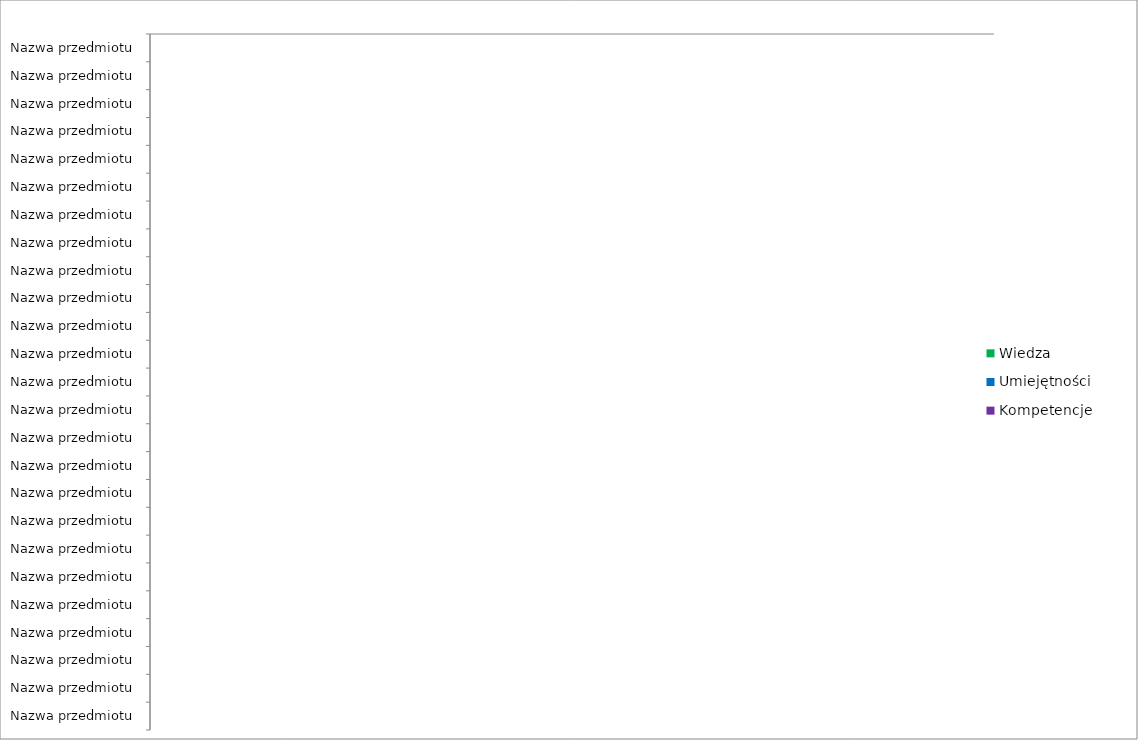
| Category | Wiedza | Umiejętności | Kompetencje |
|---|---|---|---|
| Nazwa przedmiotu | 0 | 0 | 0 |
| Nazwa przedmiotu | 0 | 0 | 0 |
| Nazwa przedmiotu | 0 | 0 | 0 |
| Nazwa przedmiotu | 0 | 0 | 0 |
| Nazwa przedmiotu | 0 | 0 | 0 |
| Nazwa przedmiotu | 0 | 0 | 0 |
| Nazwa przedmiotu | 0 | 0 | 0 |
| Nazwa przedmiotu | 0 | 0 | 0 |
| Nazwa przedmiotu | 0 | 0 | 0 |
| Nazwa przedmiotu | 0 | 0 | 0 |
| Nazwa przedmiotu | 0 | 0 | 0 |
| Nazwa przedmiotu | 0 | 0 | 0 |
| Nazwa przedmiotu | 0 | 0 | 0 |
| Nazwa przedmiotu | 0 | 0 | 0 |
| Nazwa przedmiotu | 0 | 0 | 0 |
| Nazwa przedmiotu | 0 | 0 | 0 |
| Nazwa przedmiotu | 0 | 0 | 0 |
| Nazwa przedmiotu | 0 | 0 | 0 |
| Nazwa przedmiotu | 0 | 0 | 0 |
| Nazwa przedmiotu | 0 | 0 | 0 |
| Nazwa przedmiotu | 0 | 0 | 0 |
| Nazwa przedmiotu | 0 | 0 | 0 |
| Nazwa przedmiotu | 0 | 0 | 0 |
| Nazwa przedmiotu | 0 | 0 | 0 |
| Nazwa przedmiotu | 0 | 0 | 0 |